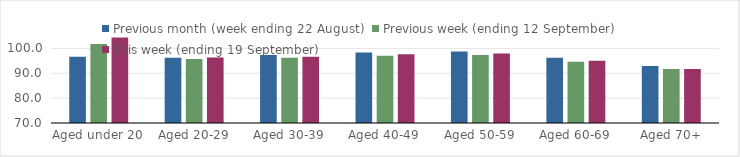
| Category | Previous month (week ending 22 August) | Previous week (ending 12 September) | This week (ending 19 September) |
|---|---|---|---|
| Aged under 20 | 96.62 | 101.81 | 104.41 |
| Aged 20-29 | 96.2 | 95.76 | 96.37 |
| Aged 30-39 | 97.37 | 96.3 | 96.65 |
| Aged 40-49 | 98.33 | 97.08 | 97.63 |
| Aged 50-59 | 98.79 | 97.36 | 97.92 |
| Aged 60-69 | 96.25 | 94.61 | 95 |
| Aged 70+ | 92.95 | 91.7 | 91.76 |